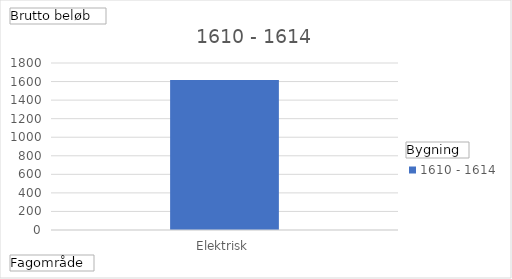
| Category | 1610 - 1614 |
|---|---|
| Elektrisk | 1618 |